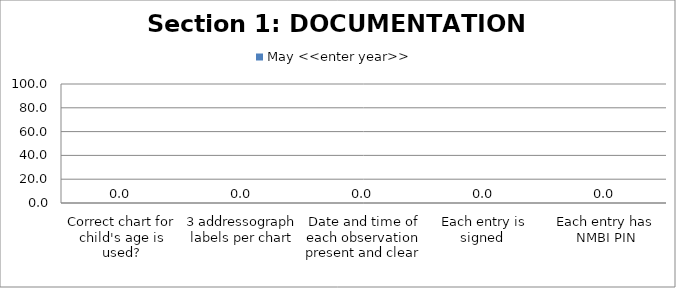
| Category | May <<enter year>> |
|---|---|
| Correct chart for child's age is used? | 0 |
| 3 addressograph labels per chart | 0 |
| Date and time of each observation present and clear  | 0 |
| Each entry is signed  | 0 |
| Each entry has NMBI PIN | 0 |